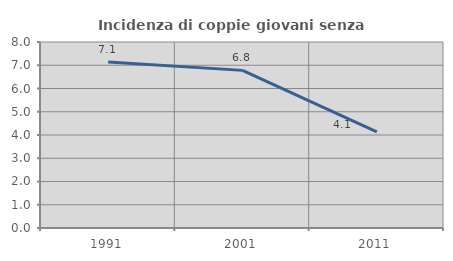
| Category | Incidenza di coppie giovani senza figli |
|---|---|
| 1991.0 | 7.143 |
| 2001.0 | 6.78 |
| 2011.0 | 4.136 |